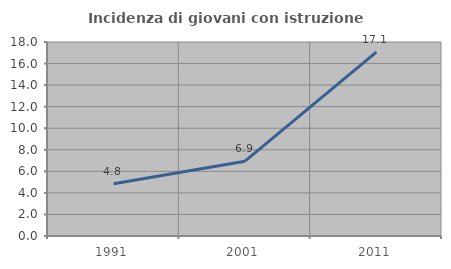
| Category | Incidenza di giovani con istruzione universitaria |
|---|---|
| 1991.0 | 4.839 |
| 2001.0 | 6.944 |
| 2011.0 | 17.059 |